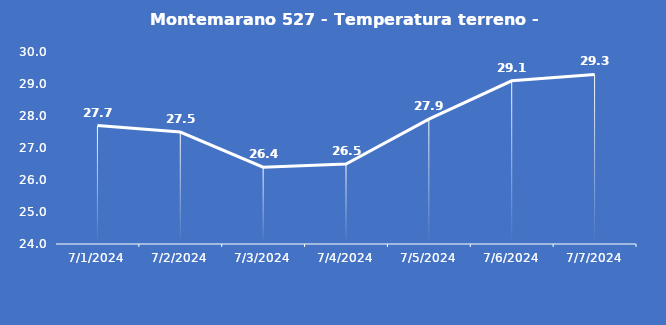
| Category | Montemarano 527 - Temperatura terreno - Grezzo (°C) |
|---|---|
| 7/1/24 | 27.7 |
| 7/2/24 | 27.5 |
| 7/3/24 | 26.4 |
| 7/4/24 | 26.5 |
| 7/5/24 | 27.9 |
| 7/6/24 | 29.1 |
| 7/7/24 | 29.3 |